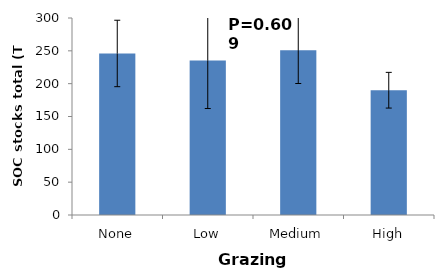
| Category | Series 0 |
|---|---|
| None | 246.007 |
| Low | 235.27 |
| Medium | 251.057 |
| High | 190.014 |